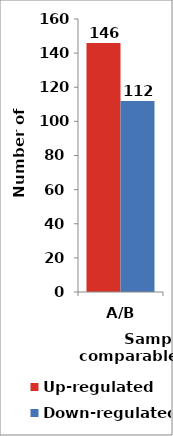
| Category | Up-regulated | Down-regulated |
|---|---|---|
| A/B | 146 | 112 |